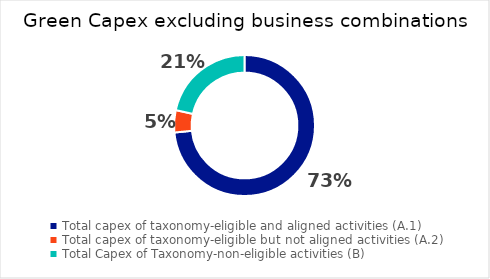
| Category | Series 0 |
|---|---|
| Total capex of taxonomy-eligible and aligned activities (A.1) | 0.734 |
| Total capex of taxonomy-eligible but not aligned activities (A.2) | 0.051 |
| Total Capex of Taxonomy-non-eligible activities (B) | 0.215 |